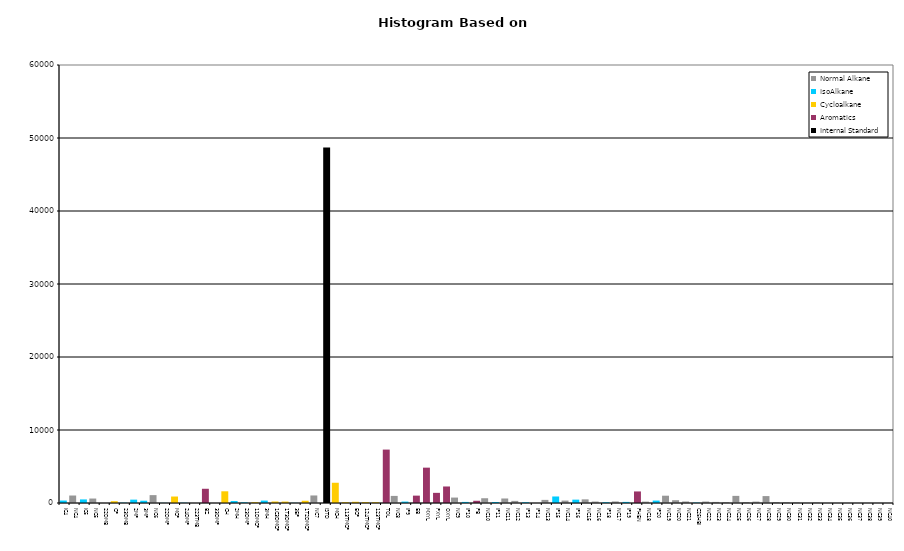
| Category | Normal Alkane | IsoAlkane | Cycloalkane | Aromatics | Internal Standard |
|---|---|---|---|---|---|
| IC4 | 0 | 337 | 0 | 0 | 0 |
| NC4 | 1025 | 0 | 0 | 0 | 0 |
| IC5 | 0 | 491 | 0 | 0 | 0 |
| NC5 | 612 | 0 | 0 | 0 | 0 |
| 22DMB | 0 | 0 | 0 | 0 | 0 |
| CP | 0 | 0 | 248 | 0 | 0 |
| 23DMB | 0 | 41 | 0 | 0 | 0 |
| 2MP | 0 | 461 | 0 | 0 | 0 |
| 3MP | 0 | 313 | 0 | 0 | 0 |
| NC6 | 1079 | 0 | 0 | 0 | 0 |
| 22DMP | 0 | 19 | 0 | 0 | 0 |
| MCP | 0 | 0 | 887 | 0 | 0 |
| 24DMP | 0 | 36 | 0 | 0 | 0 |
| 223TMB | 0 | 0 | 0 | 0 | 0 |
| BZ | 0 | 0 | 0 | 1949 | 0 |
| 33DMP | 0 | 0 | 0 | 0 | 0 |
| CH | 0 | 0 | 1604 | 0 | 0 |
| 2MH | 0 | 269 | 0 | 0 | 0 |
| 23DMP | 0 | 91 | 0 | 0 | 0 |
| 11DMCP | 0 | 0 | 106 | 0 | 0 |
| 3MH | 0 | 330 | 0 | 0 | 0 |
| 1C3DMCP | 0 | 0 | 207 | 0 | 0 |
| 1T3DMCP | 0 | 0 | 196 | 0 | 0 |
| 3EP | 0 | 20 | 0 | 0 | 0 |
| 1T2DMCP | 0 | 0 | 307 | 0 | 0 |
| NC7 | 1032 | 0 | 0 | 0 | 0 |
| ISTD | 0 | 0 | 0 | 0 | 48711 |
| MCH | 0 | 0 | 2773 | 0 | 0 |
| 113TMCP | 0 | 0 | 107 | 0 | 0 |
| ECP | 0 | 0 | 168 | 0 | 0 |
| 124TMCP | 0 | 0 | 121 | 0 | 0 |
| 123TMCP | 0 | 0 | 103 | 0 | 0 |
| TOL | 0 | 0 | 0 | 7317 | 0 |
| NC8 | 972 | 0 | 0 | 0 | 0 |
| IP9 | 0 | 196 | 0 | 0 | 0 |
| EB | 0 | 0 | 0 | 1009 | 0 |
| MXYL | 0 | 0 | 0 | 4842 | 0 |
| PXYL | 0 | 0 | 0 | 1390 | 0 |
| OXYL | 0 | 0 | 0 | 2263 | 0 |
| NC9 | 744 | 0 | 0 | 0 | 0 |
| IP10 | 0 | 149 | 0 | 0 | 0 |
| PB | 0 | 0 | 0 | 306 | 0 |
| NC10 | 653 | 0 | 0 | 0 | 0 |
| IP11 | 0 | 136 | 0 | 0 | 0 |
| NC11 | 618 | 0 | 0 | 0 | 0 |
| NC12 | 290 | 0 | 0 | 0 | 0 |
| IP13 | 0 | 100 | 0 | 0 | 0 |
| IP14 | 0 | 0 | 0 | 0 | 0 |
| NC13 | 426 | 0 | 0 | 0 | 0 |
| IP15 | 0 | 893 | 0 | 0 | 0 |
| NC14 | 332 | 0 | 0 | 0 | 0 |
| IP16 | 0 | 460 | 0 | 0 | 0 |
| NC15 | 499 | 0 | 0 | 0 | 0 |
| NC16 | 199 | 0 | 0 | 0 | 0 |
| IP18 | 0 | 101 | 0 | 0 | 0 |
| NC17 | 212 | 0 | 0 | 0 | 0 |
| IP19 | 0 | 151 | 0 | 0 | 0 |
| PHEN | 0 | 0 | 0 | 1583 | 0 |
| NC18 | 189 | 0 | 0 | 0 | 0 |
| IP20 | 0 | 334 | 0 | 0 | 0 |
| NC19 | 999 | 0 | 0 | 0 | 0 |
| NC20 | 384 | 0 | 0 | 0 | 0 |
| NC21 | 209 | 0 | 0 | 0 | 0 |
| C25HBI | 0 | 54 | 0 | 0 | 0 |
| NC22 | 200 | 0 | 0 | 0 | 0 |
| NC23 | 148 | 0 | 0 | 0 | 0 |
| NC24 | 115 | 0 | 0 | 0 | 0 |
| NC25 | 976 | 0 | 0 | 0 | 0 |
| NC26 | 122 | 0 | 0 | 0 | 0 |
| NC27 | 190 | 0 | 0 | 0 | 0 |
| NC28 | 948 | 0 | 0 | 0 | 0 |
| NC29 | 129 | 0 | 0 | 0 | 0 |
| NC30 | 107 | 0 | 0 | 0 | 0 |
| NC31 | 82 | 0 | 0 | 0 | 0 |
| NC32 | 24 | 0 | 0 | 0 | 0 |
| NC33 | 69 | 0 | 0 | 0 | 0 |
| NC34 | 0 | 0 | 0 | 0 | 0 |
| NC35 | 0 | 0 | 0 | 0 | 0 |
| NC36 | 0 | 0 | 0 | 0 | 0 |
| NC37 | 0 | 0 | 0 | 0 | 0 |
| NC38 | 0 | 0 | 0 | 0 | 0 |
| NC39 | 0 | 0 | 0 | 0 | 0 |
| NC40 | 0 | 0 | 0 | 0 | 0 |